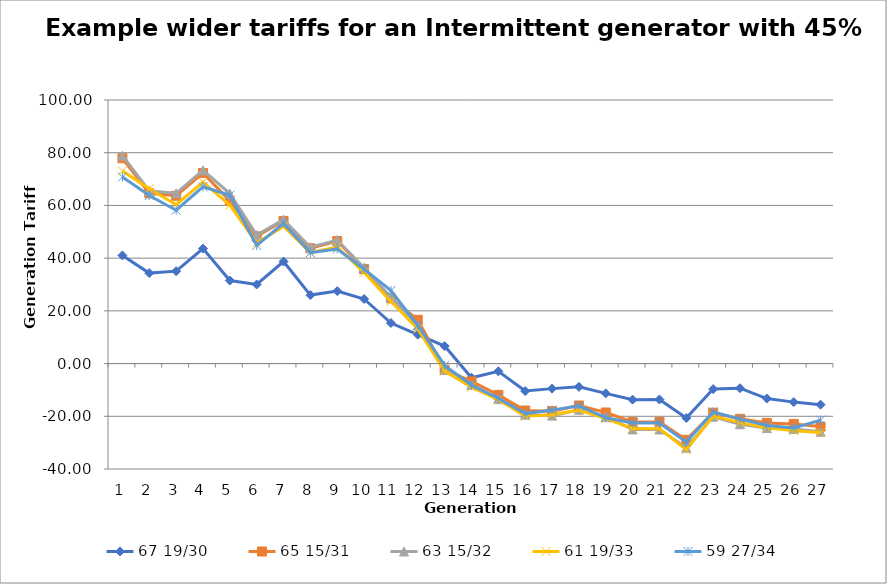
| Category | 67 19/30 | 65 15/31 | 63 15/32 | 61 19/33 | 59 27/34 |
|---|---|---|---|---|---|
| 0 | 41.026 | 77.903 | 78.87 | 73.062 | 70.771 |
| 1 | 34.327 | 64.599 | 65.509 | 66.325 | 63.777 |
| 2 | 35.07 | 63.666 | 64.577 | 60.276 | 58.182 |
| 3 | 43.63 | 72.289 | 73.354 | 68.83 | 67.084 |
| 4 | 31.497 | 61.741 | 64.485 | 60.111 | 63.874 |
| 5 | 30.014 | 48.258 | 48.724 | 45.781 | 44.809 |
| 6 | 38.718 | 54.113 | 54.613 | 52.048 | 53.193 |
| 7 | 25.985 | 43.744 | 44.153 | 42.12 | 42.06 |
| 8 | 27.507 | 46.49 | 46.858 | 44.153 | 43.483 |
| 9 | 24.507 | 35.849 | 36.366 | 34.555 | 35.831 |
| 10 | 15.388 | 24.745 | 25.086 | 23.54 | 27.738 |
| 11 | 10.972 | 16.619 | 14.424 | 13.092 | 14.449 |
| 12 | 6.624 | -2.333 | -2.423 | -2.868 | -0.707 |
| 13 | -5.37 | -6.762 | -8.039 | -8.934 | -8.185 |
| 14 | -2.948 | -11.892 | -13.479 | -13.649 | -13.151 |
| 15 | -10.43 | -17.805 | -19.394 | -19.964 | -18.982 |
| 16 | -9.505 | -18.077 | -19.747 | -19.431 | -17.656 |
| 17 | -8.833 | -15.909 | -17.519 | -17.617 | -16.006 |
| 18 | -11.306 | -18.563 | -20.168 | -20.88 | -20.589 |
| 19 | -13.683 | -22.14 | -24.971 | -24.663 | -22.548 |
| 20 | -13.622 | -22.164 | -25.008 | -24.688 | -22.556 |
| 21 | -20.671 | -28.916 | -31.945 | -32.666 | -29.795 |
| 22 | -9.685 | -18.633 | -20.164 | -19.915 | -18.384 |
| 23 | -9.352 | -20.965 | -23.025 | -22.415 | -21.079 |
| 24 | -13.266 | -22.519 | -24.471 | -24.35 | -23.507 |
| 25 | -14.624 | -22.9 | -24.827 | -25.457 | -24.409 |
| 26 | -15.589 | -23.912 | -25.865 | -26.118 | -21.434 |